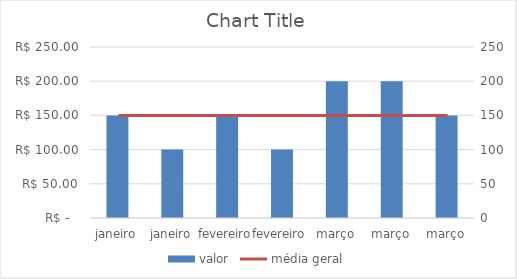
| Category | valor |
|---|---|
| janeiro | 150 |
| janeiro | 100 |
| fevereiro | 150 |
| fevereiro | 100 |
| março | 200 |
| março | 200 |
| março | 150 |